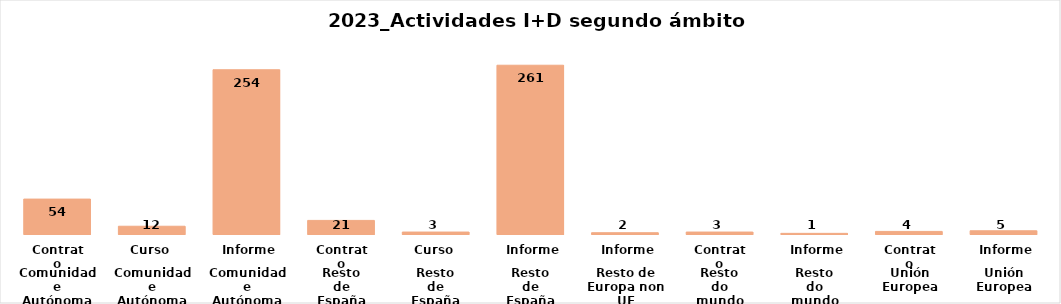
| Category | Series 0 |
|---|---|
| 0 | 54 |
| 1 | 12 |
| 2 | 254 |
| 3 | 21 |
| 4 | 3 |
| 5 | 261 |
| 6 | 2 |
| 7 | 3 |
| 8 | 1 |
| 9 | 4 |
| 10 | 5 |